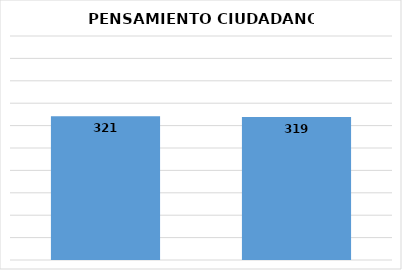
| Category | Series 0 |
|---|---|
| 2014.0 | 321 |
| 2015.0 | 319 |